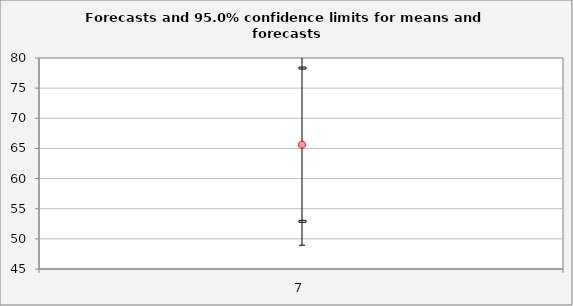
| Category | Forecast | Upper95%M | Lower95%M |
|---|---|---|---|
| 7.0 | 65.617 | 78.326 | 52.908 |